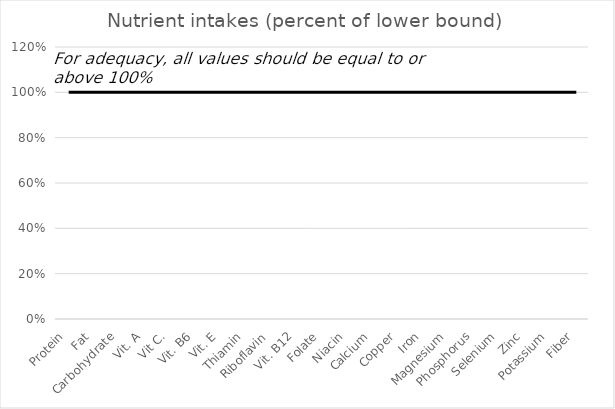
| Category | Series 0 |
|---|---|
| 0 | 0 |
| 1 | 0 |
| 2 | 0 |
| 3 | 0 |
| 4 | 0 |
| 5 | 0 |
| 6 | 0 |
| 7 | 0 |
| 8 | 0 |
| 9 | 0 |
| 10 | 0 |
| 11 | 0 |
| 12 | 0 |
| 13 | 0 |
| 14 | 0 |
| 15 | 0 |
| 16 | 0 |
| 17 | 0 |
| 18 | 0 |
| 19 | 0 |
| 20 | 0 |